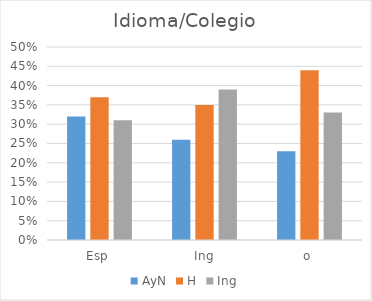
| Category | AyN | H | Ing |
|---|---|---|---|
| Esp | 0.32 | 0.37 | 0.31 |
| Ing | 0.26 | 0.35 | 0.39 |
| o | 0.23 | 0.44 | 0.33 |